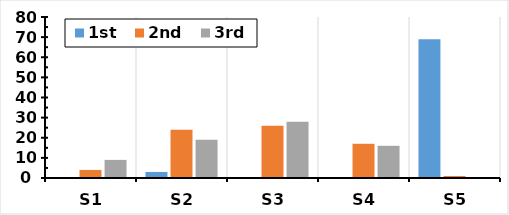
| Category | 1st | 2nd | 3rd |
|---|---|---|---|
| S1 | 0 | 4 | 9 |
| S2 | 3 | 24 | 19 |
| S3 | 0 | 26 | 28 |
| S4 | 0 | 17 | 16 |
| S5 | 69 | 1 | 0 |